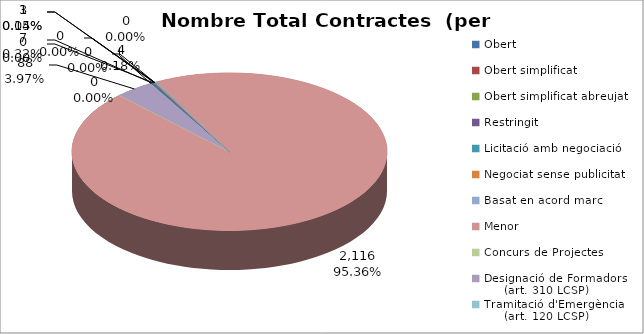
| Category | Nombre Total Contractes |
|---|---|
| Obert | 7 |
| Obert simplificat | 0 |
| Obert simplificat abreujat | 3 |
| Restringit | 0 |
| Licitació amb negociació | 0 |
| Negociat sense publicitat | 1 |
| Basat en acord marc | 4 |
| Menor | 2116 |
| Concurs de Projectes | 0 |
| Designació de Formadors
     (art. 310 LCSP) | 88 |
| Tramitació d'Emergència
     (art. 120 LCSP) | 0 |